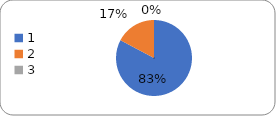
| Category | Series 0 |
|---|---|
| 0 | 96 |
| 1 | 20 |
| 2 | 0 |